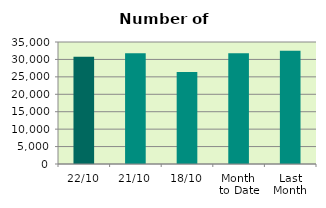
| Category | Series 0 |
|---|---|
| 22/10 | 30752 |
| 21/10 | 31790 |
| 18/10 | 26380 |
| Month 
to Date | 31804 |
| Last
Month | 32492.381 |